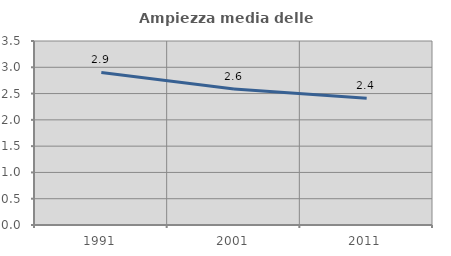
| Category | Ampiezza media delle famiglie |
|---|---|
| 1991.0 | 2.903 |
| 2001.0 | 2.587 |
| 2011.0 | 2.411 |